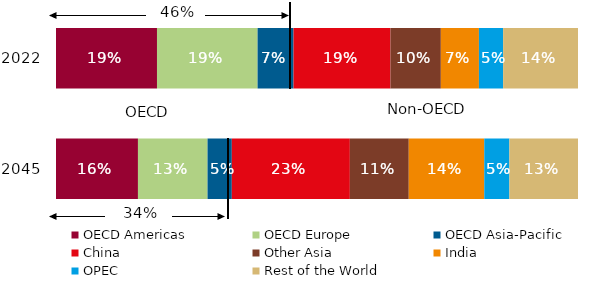
| Category | OECD Americas | OECD Europe | OECD Asia-Pacific | China | Other Asia | India | OPEC | Rest of the World |
|---|---|---|---|---|---|---|---|---|
| 2045.0 | 0.157 | 0.133 | 0.047 | 0.226 | 0.113 | 0.145 | 0.048 | 0.131 |
| 2022.0 | 0.193 | 0.193 | 0.069 | 0.186 | 0.097 | 0.073 | 0.046 | 0.143 |